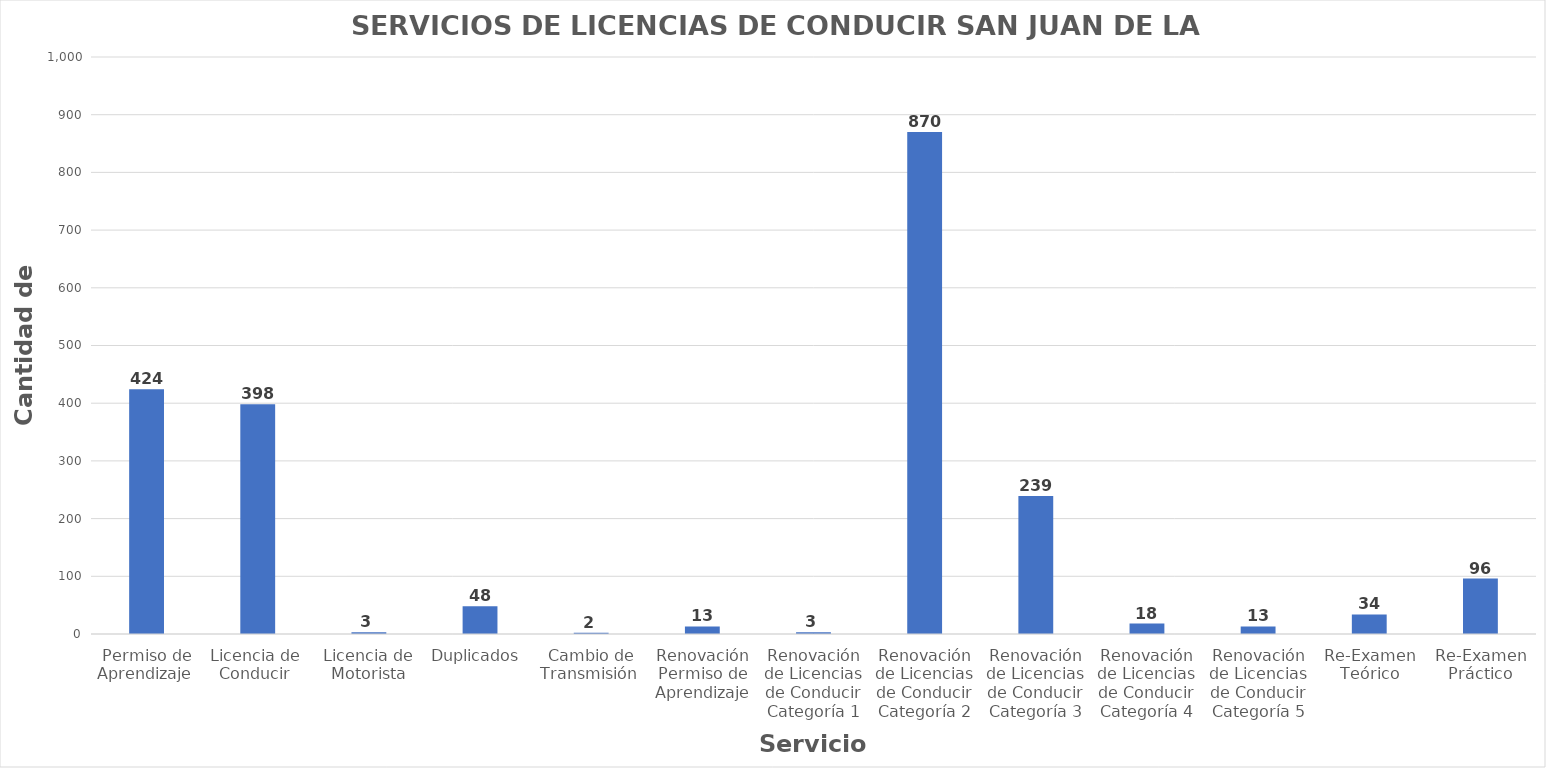
| Category | Series 0 |
|---|---|
| Permiso de Aprendizaje  | 424 |
| Licencia de  Conducir  | 398 |
| Licencia de Motorista | 3 |
| Duplicados  | 48 |
| Cambio de Transmisión  | 2 |
| Renovación Permiso de Aprendizaje | 13 |
| Renovación de Licencias de Conducir Categoría 1 | 3 |
| Renovación de Licencias de Conducir Categoría 2 | 870 |
| Renovación de Licencias de Conducir Categoría 3 | 239 |
| Renovación de Licencias de Conducir Categoría 4 | 18 |
| Renovación de Licencias de Conducir Categoría 5 | 13 |
| Re-Examen Teórico | 34 |
| Re-Examen Práctico | 96 |